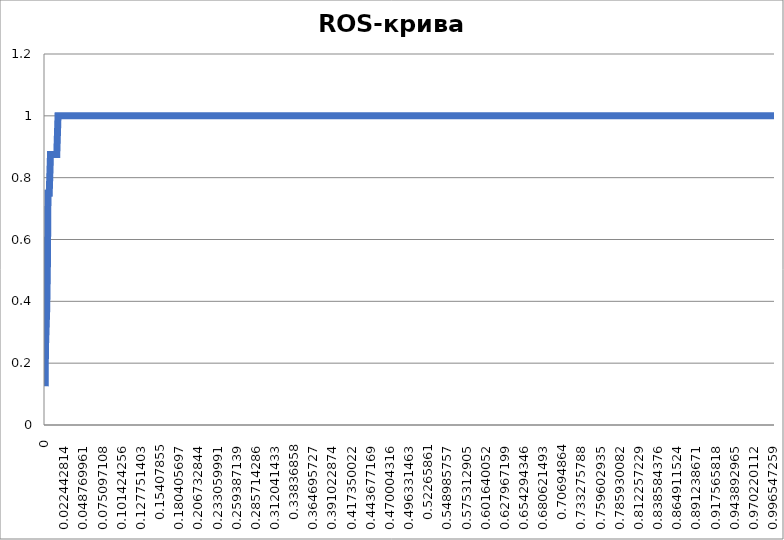
| Category | Чувствительность |
|---|---|
| 0.0 | 0.125 |
| 0.0 | 0.25 |
| 0.0 | 0.25 |
| 0.0 | 0.25 |
| 0.000431592576607631 | 0.25 |
| 0.000863185153215373 | 0.375 |
| 0.001294777729823 | 0.375 |
| 0.001294777729823 | 0.5 |
| 0.00172637030643075 | 0.625 |
| 0.00172637030643075 | 0.75 |
| 0.00172637030643075 | 0.75 |
| 0.00172637030643075 | 0.75 |
| 0.00215796288303838 | 0.75 |
| 0.00258955545964612 | 0.75 |
| 0.00302114803625375 | 0.75 |
| 0.00345274061286149 | 0.75 |
| 0.00388433318946912 | 0.75 |
| 0.00431592576607687 | 0.875 |
| 0.0047475183426845 | 0.875 |
| 0.0047475183426845 | 0.875 |
| 0.00517911091929224 | 0.875 |
| 0.00561070349589987 | 0.875 |
| 0.0060422960725075 | 0.875 |
| 0.00647388864911525 | 0.875 |
| 0.00690548122572288 | 0.875 |
| 0.00733707380233062 | 0.875 |
| 0.00776866637893825 | 0.875 |
| 0.00820025895554599 | 0.875 |
| 0.00863185153215362 | 0.875 |
| 0.00906344410876137 | 0.875 |
| 0.009495036685369 | 0.875 |
| 0.00992662926197674 | 0.875 |
| 0.0103582218385844 | 0.875 |
| 0.0107898144151921 | 0.875 |
| 0.0112214069917997 | 0.875 |
| 0.0116529995684074 | 0.875 |
| 0.0120845921450151 | 0.875 |
| 0.0125161847216227 | 0.875 |
| 0.0129477772982305 | 0.875 |
| 0.0133793698748381 | 0.875 |
| 0.0138109624514459 | 0.875 |
| 0.0142425550280535 | 1 |
| 0.0146741476046612 | 1 |
| 0.0146741476046612 | 1 |
| 0.0151057401812689 | 1 |
| 0.0155373327578766 | 1 |
| 0.0159689253344842 | 1 |
| 0.016400517911092 | 1 |
| 0.0168321104876996 | 1 |
| 0.0172637030643072 | 1 |
| 0.017695295640915 | 1 |
| 0.0181268882175226 | 1 |
| 0.0185584807941304 | 1 |
| 0.018990073370738 | 1 |
| 0.0194216659473457 | 1 |
| 0.0198532585239534 | 1 |
| 0.0202848511005611 | 1 |
| 0.0207164436771687 | 1 |
| 0.0211480362537765 | 1 |
| 0.0215796288303841 | 1 |
| 0.0220112214069919 | 1 |
| 0.0224428139835995 | 1 |
| 0.0228744065602071 | 1 |
| 0.0233059991368149 | 1 |
| 0.0237375917134225 | 1 |
| 0.0241691842900302 | 1 |
| 0.0246007768666379 | 1 |
| 0.0250323694432456 | 1 |
| 0.0254639620198532 | 1 |
| 0.025895554596461 | 1 |
| 0.0263271471730686 | 1 |
| 0.0267587397496764 | 1 |
| 0.027190332326284 | 1 |
| 0.0276219249028917 | 1 |
| 0.0280535174794994 | 1 |
| 0.028485110056107 | 1 |
| 0.0289167026327147 | 1 |
| 0.0293482952093224 | 1 |
| 0.0297798877859301 | 1 |
| 0.0302114803625377 | 1 |
| 0.0306430729391455 | 1 |
| 0.0310746655157531 | 1 |
| 0.0315062580923608 | 1 |
| 0.0319378506689685 | 1 |
| 0.0323694432455762 | 1 |
| 0.0328010358221839 | 1 |
| 0.0332326283987915 | 1 |
| 0.0336642209753992 | 1 |
| 0.0340958135520069 | 1 |
| 0.0345274061286146 | 1 |
| 0.0349589987052222 | 1 |
| 0.03539059128183 | 1 |
| 0.0358221838584376 | 1 |
| 0.0362537764350453 | 1 |
| 0.036685369011653 | 1 |
| 0.0371169615882607 | 1 |
| 0.0375485541648684 | 1 |
| 0.0379801467414761 | 1 |
| 0.0384117393180837 | 1 |
| 0.0388433318946914 | 1 |
| 0.0392749244712991 | 1 |
| 0.0397065170479067 | 1 |
| 0.0401381096245145 | 1 |
| 0.0405697022011221 | 1 |
| 0.0410012947777298 | 1 |
| 0.0414328873543375 | 1 |
| 0.0418644799309452 | 1 |
| 0.0422960725075528 | 1 |
| 0.0427276650841606 | 1 |
| 0.0431592576607682 | 1 |
| 0.043590850237376 | 1 |
| 0.0440224428139836 | 1 |
| 0.0444540353905912 | 1 |
| 0.044885627967199 | 1 |
| 0.0453172205438066 | 1 |
| 0.0457488131204143 | 1 |
| 0.046180405697022 | 1 |
| 0.0466119982736297 | 1 |
| 0.0470435908502374 | 1 |
| 0.0474751834268451 | 1 |
| 0.0479067760034527 | 1 |
| 0.0483383685800605 | 1 |
| 0.0487699611566681 | 1 |
| 0.0492015537332758 | 1 |
| 0.0496331463098835 | 1 |
| 0.0500647388864911 | 1 |
| 0.0504963314630988 | 1 |
| 0.0509279240397065 | 1 |
| 0.0513595166163142 | 1 |
| 0.0517911091929218 | 1 |
| 0.0522227017695296 | 1 |
| 0.0526542943461372 | 1 |
| 0.053085886922745 | 1 |
| 0.0535174794993526 | 1 |
| 0.0539490720759603 | 1 |
| 0.054380664652568 | 1 |
| 0.0548122572291757 | 1 |
| 0.0552438498057833 | 1 |
| 0.055675442382391 | 1 |
| 0.0561070349589987 | 1 |
| 0.0565386275356063 | 1 |
| 0.0569702201122141 | 1 |
| 0.0574018126888217 | 1 |
| 0.0578334052654295 | 1 |
| 0.0582649978420371 | 1 |
| 0.0586965904186448 | 1 |
| 0.0591281829952525 | 1 |
| 0.0595597755718602 | 1 |
| 0.0599913681484678 | 1 |
| 0.0604229607250756 | 1 |
| 0.0608545533016832 | 1 |
| 0.0612861458782908 | 1 |
| 0.0617177384548986 | 1 |
| 0.0621493310315062 | 1 |
| 0.062580923608114 | 1 |
| 0.0630125161847216 | 1 |
| 0.0634441087613293 | 1 |
| 0.063875701337937 | 1 |
| 0.0643072939145447 | 1 |
| 0.0647388864911523 | 1 |
| 0.0651704790677601 | 1 |
| 0.0656020716443677 | 1 |
| 0.0660336642209755 | 1 |
| 0.0664652567975831 | 1 |
| 0.0668968493741907 | 1 |
| 0.0673284419507985 | 1 |
| 0.0677600345274061 | 1 |
| 0.0681916271040138 | 1 |
| 0.0686232196806215 | 1 |
| 0.0690548122572292 | 1 |
| 0.0694864048338368 | 1 |
| 0.0699179974104446 | 1 |
| 0.0703495899870522 | 1 |
| 0.07078118256366 | 1 |
| 0.0712127751402676 | 1 |
| 0.0716443677168753 | 1 |
| 0.072075960293483 | 1 |
| 0.0725075528700906 | 1 |
| 0.0729391454466983 | 1 |
| 0.073370738023306 | 1 |
| 0.0738023305999137 | 1 |
| 0.0742339231765213 | 1 |
| 0.0746655157531291 | 1 |
| 0.0750971083297367 | 1 |
| 0.0755287009063444 | 1 |
| 0.0759602934829521 | 1 |
| 0.0763918860595598 | 1 |
| 0.0768234786361675 | 1 |
| 0.0772550712127752 | 1 |
| 0.0776866637893828 | 1 |
| 0.0781182563659905 | 1 |
| 0.0785498489425982 | 1 |
| 0.0789814415192058 | 1 |
| 0.0794130340958136 | 1 |
| 0.0798446266724212 | 1 |
| 0.0802762192490289 | 1 |
| 0.0807078118256366 | 1 |
| 0.0811394044022443 | 1 |
| 0.081570996978852 | 1 |
| 0.0820025895554597 | 1 |
| 0.0824341821320673 | 1 |
| 0.0828657747086751 | 1 |
| 0.0832973672852827 | 1 |
| 0.0837289598618903 | 1 |
| 0.0841605524384981 | 1 |
| 0.0845921450151057 | 1 |
| 0.0850237375917135 | 1 |
| 0.0854553301683211 | 1 |
| 0.0858869227449288 | 1 |
| 0.0863185153215365 | 1 |
| 0.0867501078981442 | 1 |
| 0.0871817004747518 | 1 |
| 0.0876132930513596 | 1 |
| 0.0880448856279672 | 1 |
| 0.0884764782045748 | 1 |
| 0.0889080707811826 | 1 |
| 0.0893396633577902 | 1 |
| 0.0897712559343979 | 1 |
| 0.0902028485110056 | 1 |
| 0.0906344410876133 | 1 |
| 0.0910660336642209 | 1 |
| 0.0914976262408287 | 1 |
| 0.0919292188174363 | 1 |
| 0.0923608113940441 | 1 |
| 0.0927924039706517 | 1 |
| 0.0932239965472594 | 1 |
| 0.0936555891238671 | 1 |
| 0.0940871817004747 | 1 |
| 0.0945187742770824 | 1 |
| 0.0949503668536901 | 1 |
| 0.0953819594302978 | 1 |
| 0.0958135520069054 | 1 |
| 0.0962451445835132 | 1 |
| 0.0966767371601208 | 1 |
| 0.0971083297367286 | 1 |
| 0.0975399223133362 | 1 |
| 0.0979715148899439 | 1 |
| 0.0984031074665516 | 1 |
| 0.0988347000431593 | 1 |
| 0.0992662926197669 | 1 |
| 0.0996978851963746 | 1 |
| 0.100129477772982 | 1 |
| 0.10056107034959 | 1 |
| 0.100992662926198 | 1 |
| 0.101424255502805 | 1 |
| 0.101855848079413 | 1 |
| 0.102287440656021 | 1 |
| 0.102719033232628 | 1 |
| 0.103150625809236 | 1 |
| 0.103582218385844 | 1 |
| 0.104013810962451 | 1 |
| 0.104445403539059 | 1 |
| 0.104876996115667 | 1 |
| 0.105308588692274 | 1 |
| 0.105740181268882 | 1 |
| 0.10617177384549 | 1 |
| 0.106603366422098 | 1 |
| 0.107034958998705 | 1 |
| 0.107466551575313 | 1 |
| 0.107898144151921 | 1 |
| 0.108329736728528 | 1 |
| 0.108761329305136 | 1 |
| 0.109192921881744 | 1 |
| 0.109624514458351 | 1 |
| 0.110056107034959 | 1 |
| 0.110487699611567 | 1 |
| 0.110919292188174 | 1 |
| 0.111350884764782 | 1 |
| 0.11178247734139 | 1 |
| 0.112214069917997 | 1 |
| 0.112645662494605 | 1 |
| 0.113077255071213 | 1 |
| 0.11350884764782 | 1 |
| 0.113940440224428 | 1 |
| 0.114372032801036 | 1 |
| 0.114803625377644 | 1 |
| 0.115235217954251 | 1 |
| 0.115666810530859 | 1 |
| 0.116098403107467 | 1 |
| 0.116529995684074 | 1 |
| 0.116961588260682 | 1 |
| 0.11739318083729 | 1 |
| 0.117824773413897 | 1 |
| 0.118256365990505 | 1 |
| 0.118687958567113 | 1 |
| 0.11911955114372 | 1 |
| 0.119551143720328 | 1 |
| 0.119982736296936 | 1 |
| 0.120414328873543 | 1 |
| 0.120845921450151 | 1 |
| 0.121277514026759 | 1 |
| 0.121709106603366 | 1 |
| 0.122140699179974 | 1 |
| 0.122572291756582 | 1 |
| 0.123003884333189 | 1 |
| 0.123435476909797 | 1 |
| 0.123867069486405 | 1 |
| 0.124298662063013 | 1 |
| 0.12473025463962 | 1 |
| 0.125161847216228 | 1 |
| 0.125593439792836 | 1 |
| 0.126025032369443 | 1 |
| 0.126456624946051 | 1 |
| 0.126888217522659 | 1 |
| 0.127319810099266 | 1 |
| 0.127751402675874 | 1 |
| 0.128182995252482 | 1 |
| 0.128614587829089 | 1 |
| 0.129046180405697 | 1 |
| 0.129477772982305 | 1 |
| 0.129909365558912 | 1 |
| 0.13034095813552 | 1 |
| 0.130772550712128 | 1 |
| 0.131204143288735 | 1 |
| 0.131635735865343 | 1 |
| 0.132067328441951 | 1 |
| 0.132498921018559 | 1 |
| 0.132930513595166 | 1 |
| 0.133362106171774 | 1 |
| 0.133793698748382 | 1 |
| 0.134225291324989 | 1 |
| 0.134656883901597 | 1 |
| 0.135088476478205 | 1 |
| 0.135520069054812 | 1 |
| 0.13595166163142 | 1 |
| 0.136383254208028 | 1 |
| 0.136814846784635 | 1 |
| 0.137246439361243 | 1 |
| 0.137678031937851 | 1 |
| 0.138109624514458 | 1 |
| 0.138541217091066 | 1 |
| 0.138972809667674 | 1 |
| 0.139404402244281 | 1 |
| 0.139835994820889 | 1 |
| 0.140267587397497 | 1 |
| 0.140699179974104 | 1 |
| 0.141130772550712 | 1 |
| 0.14156236512732 | 1 |
| 0.141993957703928 | 1 |
| 0.142425550280535 | 1 |
| 0.142857142857143 | 1 |
| 0.143288735433751 | 1 |
| 0.143720328010358 | 1 |
| 0.144151920586966 | 1 |
| 0.144583513163574 | 1 |
| 0.145015105740181 | 1 |
| 0.145446698316789 | 1 |
| 0.145878290893397 | 1 |
| 0.146309883470004 | 1 |
| 0.146741476046612 | 1 |
| 0.14717306862322 | 1 |
| 0.147604661199827 | 1 |
| 0.148036253776435 | 1 |
| 0.148467846353043 | 1 |
| 0.14889943892965 | 1 |
| 0.149331031506258 | 1 |
| 0.149762624082866 | 1 |
| 0.150194216659473 | 1 |
| 0.150625809236081 | 1 |
| 0.151057401812689 | 1 |
| 0.151488994389297 | 1 |
| 0.151920586965904 | 1 |
| 0.152352179542512 | 1 |
| 0.15278377211912 | 1 |
| 0.153215364695727 | 1 |
| 0.153646957272335 | 1 |
| 0.154078549848943 | 1 |
| 0.15451014242555 | 1 |
| 0.154941735002158 | 1 |
| 0.155373327578766 | 1 |
| 0.155804920155373 | 1 |
| 0.156236512731981 | 1 |
| 0.156668105308589 | 1 |
| 0.157099697885196 | 1 |
| 0.157531290461804 | 1 |
| 0.157962883038412 | 1 |
| 0.158394475615019 | 1 |
| 0.158826068191627 | 1 |
| 0.159257660768235 | 1 |
| 0.159689253344843 | 1 |
| 0.16012084592145 | 1 |
| 0.160552438498058 | 1 |
| 0.160984031074666 | 1 |
| 0.161415623651273 | 1 |
| 0.161847216227881 | 1 |
| 0.162278808804489 | 1 |
| 0.162710401381096 | 1 |
| 0.163141993957704 | 1 |
| 0.163573586534312 | 1 |
| 0.164005179110919 | 1 |
| 0.164436771687527 | 1 |
| 0.164868364264135 | 1 |
| 0.165299956840742 | 1 |
| 0.16573154941735 | 1 |
| 0.166163141993958 | 1 |
| 0.166594734570565 | 1 |
| 0.167026327147173 | 1 |
| 0.167457919723781 | 1 |
| 0.167889512300388 | 1 |
| 0.168321104876996 | 1 |
| 0.168752697453604 | 1 |
| 0.169184290030212 | 1 |
| 0.169615882606819 | 1 |
| 0.170047475183427 | 1 |
| 0.170479067760035 | 1 |
| 0.170910660336642 | 1 |
| 0.17134225291325 | 1 |
| 0.171773845489858 | 1 |
| 0.172205438066465 | 1 |
| 0.172637030643073 | 1 |
| 0.173068623219681 | 1 |
| 0.173500215796288 | 1 |
| 0.173931808372896 | 1 |
| 0.174363400949504 | 1 |
| 0.174794993526111 | 1 |
| 0.175226586102719 | 1 |
| 0.175658178679327 | 1 |
| 0.176089771255934 | 1 |
| 0.176521363832542 | 1 |
| 0.17695295640915 | 1 |
| 0.177384548985757 | 1 |
| 0.177816141562365 | 1 |
| 0.178247734138973 | 1 |
| 0.178679326715581 | 1 |
| 0.179110919292188 | 1 |
| 0.179542511868796 | 1 |
| 0.179974104445404 | 1 |
| 0.180405697022011 | 1 |
| 0.180837289598619 | 1 |
| 0.181268882175227 | 1 |
| 0.181700474751834 | 1 |
| 0.182132067328442 | 1 |
| 0.18256365990505 | 1 |
| 0.182995252481657 | 1 |
| 0.183426845058265 | 1 |
| 0.183858437634873 | 1 |
| 0.18429003021148 | 1 |
| 0.184721622788088 | 1 |
| 0.185153215364696 | 1 |
| 0.185584807941303 | 1 |
| 0.186016400517911 | 1 |
| 0.186447993094519 | 1 |
| 0.186879585671127 | 1 |
| 0.187311178247734 | 1 |
| 0.187742770824342 | 1 |
| 0.18817436340095 | 1 |
| 0.188605955977557 | 1 |
| 0.189037548554165 | 1 |
| 0.189469141130773 | 1 |
| 0.18990073370738 | 1 |
| 0.190332326283988 | 1 |
| 0.190763918860596 | 1 |
| 0.191195511437203 | 1 |
| 0.191627104013811 | 1 |
| 0.192058696590419 | 1 |
| 0.192490289167026 | 1 |
| 0.192921881743634 | 1 |
| 0.193353474320242 | 1 |
| 0.193785066896849 | 1 |
| 0.194216659473457 | 1 |
| 0.194648252050065 | 1 |
| 0.195079844626672 | 1 |
| 0.19551143720328 | 1 |
| 0.195943029779888 | 1 |
| 0.196374622356496 | 1 |
| 0.196806214933103 | 1 |
| 0.197237807509711 | 1 |
| 0.197669400086319 | 1 |
| 0.198100992662926 | 1 |
| 0.198532585239534 | 1 |
| 0.198964177816142 | 1 |
| 0.199395770392749 | 1 |
| 0.199827362969357 | 1 |
| 0.200258955545965 | 1 |
| 0.200690548122572 | 1 |
| 0.20112214069918 | 1 |
| 0.201553733275788 | 1 |
| 0.201985325852395 | 1 |
| 0.202416918429003 | 1 |
| 0.202848511005611 | 1 |
| 0.203280103582218 | 1 |
| 0.203711696158826 | 1 |
| 0.204143288735434 | 1 |
| 0.204574881312041 | 1 |
| 0.205006473888649 | 1 |
| 0.205438066465257 | 1 |
| 0.205869659041864 | 1 |
| 0.206301251618472 | 1 |
| 0.20673284419508 | 1 |
| 0.207164436771687 | 1 |
| 0.207596029348295 | 1 |
| 0.208027621924903 | 1 |
| 0.208459214501511 | 1 |
| 0.208890807078118 | 1 |
| 0.209322399654726 | 1 |
| 0.209753992231334 | 1 |
| 0.210185584807941 | 1 |
| 0.210617177384549 | 1 |
| 0.211048769961157 | 1 |
| 0.211480362537764 | 1 |
| 0.211911955114372 | 1 |
| 0.21234354769098 | 1 |
| 0.212775140267587 | 1 |
| 0.213206732844195 | 1 |
| 0.213638325420803 | 1 |
| 0.21406991799741 | 1 |
| 0.214501510574018 | 1 |
| 0.214933103150626 | 1 |
| 0.215364695727233 | 1 |
| 0.215796288303841 | 1 |
| 0.216227880880449 | 1 |
| 0.216659473457056 | 1 |
| 0.217091066033664 | 1 |
| 0.217522658610272 | 1 |
| 0.21795425118688 | 1 |
| 0.218385843763487 | 1 |
| 0.218817436340095 | 1 |
| 0.219249028916703 | 1 |
| 0.21968062149331 | 1 |
| 0.220112214069918 | 1 |
| 0.220543806646526 | 1 |
| 0.220975399223133 | 1 |
| 0.221406991799741 | 1 |
| 0.221838584376349 | 1 |
| 0.222270176952956 | 1 |
| 0.222701769529564 | 1 |
| 0.223133362106172 | 1 |
| 0.223564954682779 | 1 |
| 0.223996547259387 | 1 |
| 0.224428139835995 | 1 |
| 0.224859732412602 | 1 |
| 0.22529132498921 | 1 |
| 0.225722917565818 | 1 |
| 0.226154510142426 | 1 |
| 0.226586102719033 | 1 |
| 0.227017695295641 | 1 |
| 0.227449287872249 | 1 |
| 0.227880880448856 | 1 |
| 0.228312473025464 | 1 |
| 0.228744065602072 | 1 |
| 0.229175658178679 | 1 |
| 0.229607250755287 | 1 |
| 0.230038843331895 | 1 |
| 0.230470435908502 | 1 |
| 0.23090202848511 | 1 |
| 0.231333621061718 | 1 |
| 0.231765213638325 | 1 |
| 0.232196806214933 | 1 |
| 0.232628398791541 | 1 |
| 0.233059991368148 | 1 |
| 0.233491583944756 | 1 |
| 0.233923176521364 | 1 |
| 0.234354769097971 | 1 |
| 0.234786361674579 | 1 |
| 0.235217954251187 | 1 |
| 0.235649546827795 | 1 |
| 0.236081139404402 | 1 |
| 0.23651273198101 | 1 |
| 0.236944324557618 | 1 |
| 0.237375917134225 | 1 |
| 0.237807509710833 | 1 |
| 0.238239102287441 | 1 |
| 0.238670694864048 | 1 |
| 0.239102287440656 | 1 |
| 0.239533880017264 | 1 |
| 0.239965472593871 | 1 |
| 0.240397065170479 | 1 |
| 0.240828657747087 | 1 |
| 0.241260250323694 | 1 |
| 0.241691842900302 | 1 |
| 0.24212343547691 | 1 |
| 0.242555028053517 | 1 |
| 0.242986620630125 | 1 |
| 0.243418213206733 | 1 |
| 0.24384980578334 | 1 |
| 0.244281398359948 | 1 |
| 0.244712990936556 | 1 |
| 0.245144583513164 | 1 |
| 0.245576176089771 | 1 |
| 0.246007768666379 | 1 |
| 0.246439361242987 | 1 |
| 0.246870953819594 | 1 |
| 0.247302546396202 | 1 |
| 0.24773413897281 | 1 |
| 0.248165731549417 | 1 |
| 0.248597324126025 | 1 |
| 0.249028916702633 | 1 |
| 0.24946050927924 | 1 |
| 0.249892101855848 | 1 |
| 0.250323694432456 | 1 |
| 0.250755287009063 | 1 |
| 0.251186879585671 | 1 |
| 0.251618472162279 | 1 |
| 0.252050064738886 | 1 |
| 0.252481657315494 | 1 |
| 0.252913249892102 | 1 |
| 0.25334484246871 | 1 |
| 0.253776435045317 | 1 |
| 0.254208027621925 | 1 |
| 0.254639620198533 | 1 |
| 0.25507121277514 | 1 |
| 0.255502805351748 | 1 |
| 0.255934397928356 | 1 |
| 0.256365990504963 | 1 |
| 0.256797583081571 | 1 |
| 0.257229175658179 | 1 |
| 0.257660768234786 | 1 |
| 0.258092360811394 | 1 |
| 0.258523953388002 | 1 |
| 0.258955545964609 | 1 |
| 0.259387138541217 | 1 |
| 0.259818731117825 | 1 |
| 0.260250323694432 | 1 |
| 0.26068191627104 | 1 |
| 0.261113508847648 | 1 |
| 0.261545101424255 | 1 |
| 0.261976694000863 | 1 |
| 0.262408286577471 | 1 |
| 0.262839879154079 | 1 |
| 0.263271471730686 | 1 |
| 0.263703064307294 | 1 |
| 0.264134656883902 | 1 |
| 0.264566249460509 | 1 |
| 0.264997842037117 | 1 |
| 0.265429434613725 | 1 |
| 0.265861027190332 | 1 |
| 0.26629261976694 | 1 |
| 0.266724212343548 | 1 |
| 0.267155804920155 | 1 |
| 0.267587397496763 | 1 |
| 0.268018990073371 | 1 |
| 0.268450582649978 | 1 |
| 0.268882175226586 | 1 |
| 0.269313767803194 | 1 |
| 0.269745360379801 | 1 |
| 0.270176952956409 | 1 |
| 0.270608545533017 | 1 |
| 0.271040138109624 | 1 |
| 0.271471730686232 | 1 |
| 0.27190332326284 | 1 |
| 0.272334915839448 | 1 |
| 0.272766508416055 | 1 |
| 0.273198100992663 | 1 |
| 0.273629693569271 | 1 |
| 0.274061286145878 | 1 |
| 0.274492878722486 | 1 |
| 0.274924471299094 | 1 |
| 0.275356063875701 | 1 |
| 0.275787656452309 | 1 |
| 0.276219249028917 | 1 |
| 0.276650841605524 | 1 |
| 0.277082434182132 | 1 |
| 0.27751402675874 | 1 |
| 0.277945619335347 | 1 |
| 0.278377211911955 | 1 |
| 0.278808804488563 | 1 |
| 0.27924039706517 | 1 |
| 0.279671989641778 | 1 |
| 0.280103582218386 | 1 |
| 0.280535174794994 | 1 |
| 0.280966767371601 | 1 |
| 0.281398359948209 | 1 |
| 0.281829952524817 | 1 |
| 0.282261545101424 | 1 |
| 0.282693137678032 | 1 |
| 0.28312473025464 | 1 |
| 0.283556322831247 | 1 |
| 0.283987915407855 | 1 |
| 0.284419507984463 | 1 |
| 0.28485110056107 | 1 |
| 0.285282693137678 | 1 |
| 0.285714285714286 | 1 |
| 0.286145878290893 | 1 |
| 0.286577470867501 | 1 |
| 0.287009063444109 | 1 |
| 0.287440656020716 | 1 |
| 0.287872248597324 | 1 |
| 0.288303841173932 | 1 |
| 0.288735433750539 | 1 |
| 0.289167026327147 | 1 |
| 0.289598618903755 | 1 |
| 0.290030211480363 | 1 |
| 0.29046180405697 | 1 |
| 0.290893396633578 | 1 |
| 0.291324989210186 | 1 |
| 0.291756581786793 | 1 |
| 0.292188174363401 | 1 |
| 0.292619766940009 | 1 |
| 0.293051359516616 | 1 |
| 0.293482952093224 | 1 |
| 0.293914544669832 | 1 |
| 0.294346137246439 | 1 |
| 0.294777729823047 | 1 |
| 0.295209322399655 | 1 |
| 0.295640914976262 | 1 |
| 0.29607250755287 | 1 |
| 0.296504100129478 | 1 |
| 0.296935692706085 | 1 |
| 0.297367285282693 | 1 |
| 0.297798877859301 | 1 |
| 0.298230470435909 | 1 |
| 0.298662063012516 | 1 |
| 0.299093655589124 | 1 |
| 0.299525248165732 | 1 |
| 0.299956840742339 | 1 |
| 0.300388433318947 | 1 |
| 0.300820025895555 | 1 |
| 0.301251618472162 | 1 |
| 0.30168321104877 | 1 |
| 0.302114803625378 | 1 |
| 0.302546396201985 | 1 |
| 0.302977988778593 | 1 |
| 0.303409581355201 | 1 |
| 0.303841173931808 | 1 |
| 0.304272766508416 | 1 |
| 0.304704359085024 | 1 |
| 0.305135951661631 | 1 |
| 0.305567544238239 | 1 |
| 0.305999136814847 | 1 |
| 0.306430729391454 | 1 |
| 0.306862321968062 | 1 |
| 0.30729391454467 | 1 |
| 0.307725507121278 | 1 |
| 0.308157099697885 | 1 |
| 0.308588692274493 | 1 |
| 0.309020284851101 | 1 |
| 0.309451877427708 | 1 |
| 0.309883470004316 | 1 |
| 0.310315062580924 | 1 |
| 0.310746655157531 | 1 |
| 0.311178247734139 | 1 |
| 0.311609840310747 | 1 |
| 0.312041432887354 | 1 |
| 0.312473025463962 | 1 |
| 0.31290461804057 | 1 |
| 0.313336210617177 | 1 |
| 0.313767803193785 | 1 |
| 0.314199395770393 | 1 |
| 0.314630988347 | 1 |
| 0.315062580923608 | 1 |
| 0.315494173500216 | 1 |
| 0.315925766076823 | 1 |
| 0.316357358653431 | 1 |
| 0.316788951230039 | 1 |
| 0.317220543806647 | 1 |
| 0.317652136383254 | 1 |
| 0.318083728959862 | 1 |
| 0.31851532153647 | 1 |
| 0.318946914113077 | 1 |
| 0.319378506689685 | 1 |
| 0.319810099266293 | 1 |
| 0.3202416918429 | 1 |
| 0.320673284419508 | 1 |
| 0.321104876996116 | 1 |
| 0.321536469572723 | 1 |
| 0.321968062149331 | 1 |
| 0.322399654725939 | 1 |
| 0.322831247302546 | 1 |
| 0.323262839879154 | 1 |
| 0.323694432455762 | 1 |
| 0.324126025032369 | 1 |
| 0.324557617608977 | 1 |
| 0.324989210185585 | 1 |
| 0.325420802762193 | 1 |
| 0.3258523953388 | 1 |
| 0.326283987915408 | 1 |
| 0.326715580492016 | 1 |
| 0.327147173068623 | 1 |
| 0.327578765645231 | 1 |
| 0.328010358221839 | 1 |
| 0.328441950798446 | 1 |
| 0.328873543375054 | 1 |
| 0.329305135951662 | 1 |
| 0.329736728528269 | 1 |
| 0.330168321104877 | 1 |
| 0.330599913681485 | 1 |
| 0.331031506258092 | 1 |
| 0.3314630988347 | 1 |
| 0.331894691411308 | 1 |
| 0.332326283987915 | 1 |
| 0.332757876564523 | 1 |
| 0.333189469141131 | 1 |
| 0.333621061717738 | 1 |
| 0.334052654294346 | 1 |
| 0.334484246870954 | 1 |
| 0.334915839447562 | 1 |
| 0.335347432024169 | 1 |
| 0.335779024600777 | 1 |
| 0.336210617177385 | 1 |
| 0.336642209753992 | 1 |
| 0.3370738023306 | 1 |
| 0.337505394907208 | 1 |
| 0.337936987483815 | 1 |
| 0.338368580060423 | 1 |
| 0.338800172637031 | 1 |
| 0.339231765213638 | 1 |
| 0.339663357790246 | 1 |
| 0.340094950366854 | 1 |
| 0.340526542943461 | 1 |
| 0.340958135520069 | 1 |
| 0.341389728096677 | 1 |
| 0.341821320673284 | 1 |
| 0.342252913249892 | 1 |
| 0.3426845058265 | 1 |
| 0.343116098403107 | 1 |
| 0.343547690979715 | 1 |
| 0.343979283556323 | 1 |
| 0.344410876132931 | 1 |
| 0.344842468709538 | 1 |
| 0.345274061286146 | 1 |
| 0.345705653862754 | 1 |
| 0.346137246439361 | 1 |
| 0.346568839015969 | 1 |
| 0.347000431592577 | 1 |
| 0.347432024169184 | 1 |
| 0.347863616745792 | 1 |
| 0.3482952093224 | 1 |
| 0.348726801899007 | 1 |
| 0.349158394475615 | 1 |
| 0.349589987052223 | 1 |
| 0.35002157962883 | 1 |
| 0.350453172205438 | 1 |
| 0.350884764782046 | 1 |
| 0.351316357358653 | 1 |
| 0.351747949935261 | 1 |
| 0.352179542511869 | 1 |
| 0.352611135088476 | 1 |
| 0.353042727665084 | 1 |
| 0.353474320241692 | 1 |
| 0.3539059128183 | 1 |
| 0.354337505394907 | 1 |
| 0.354769097971515 | 1 |
| 0.355200690548122 | 1 |
| 0.35563228312473 | 1 |
| 0.356063875701338 | 1 |
| 0.356495468277946 | 1 |
| 0.356927060854553 | 1 |
| 0.357358653431161 | 1 |
| 0.357790246007769 | 1 |
| 0.358221838584376 | 1 |
| 0.358653431160984 | 1 |
| 0.359085023737592 | 1 |
| 0.359516616314199 | 1 |
| 0.359948208890807 | 1 |
| 0.360379801467415 | 1 |
| 0.360811394044022 | 1 |
| 0.36124298662063 | 1 |
| 0.361674579197238 | 1 |
| 0.362106171773845 | 1 |
| 0.362537764350453 | 1 |
| 0.362969356927061 | 1 |
| 0.363400949503669 | 1 |
| 0.363832542080276 | 1 |
| 0.364264134656884 | 1 |
| 0.364695727233491 | 1 |
| 0.365127319810099 | 1 |
| 0.365558912386707 | 1 |
| 0.365990504963315 | 1 |
| 0.366422097539922 | 1 |
| 0.36685369011653 | 1 |
| 0.367285282693138 | 1 |
| 0.367716875269745 | 1 |
| 0.368148467846353 | 1 |
| 0.368580060422961 | 1 |
| 0.369011652999568 | 1 |
| 0.369443245576176 | 1 |
| 0.369874838152784 | 1 |
| 0.370306430729391 | 1 |
| 0.370738023305999 | 1 |
| 0.371169615882607 | 1 |
| 0.371601208459214 | 1 |
| 0.372032801035822 | 1 |
| 0.37246439361243 | 1 |
| 0.372895986189038 | 1 |
| 0.373327578765645 | 1 |
| 0.373759171342253 | 1 |
| 0.374190763918861 | 1 |
| 0.374622356495468 | 1 |
| 0.375053949072076 | 1 |
| 0.375485541648684 | 1 |
| 0.375917134225291 | 1 |
| 0.376348726801899 | 1 |
| 0.376780319378507 | 1 |
| 0.377211911955114 | 1 |
| 0.377643504531722 | 1 |
| 0.37807509710833 | 1 |
| 0.378506689684937 | 1 |
| 0.378938282261545 | 1 |
| 0.379369874838153 | 1 |
| 0.37980146741476 | 1 |
| 0.380233059991368 | 1 |
| 0.380664652567976 | 1 |
| 0.381096245144583 | 1 |
| 0.381527837721191 | 1 |
| 0.381959430297799 | 1 |
| 0.382391022874407 | 1 |
| 0.382822615451014 | 1 |
| 0.383254208027622 | 1 |
| 0.38368580060423 | 1 |
| 0.384117393180837 | 1 |
| 0.384548985757445 | 1 |
| 0.384980578334053 | 1 |
| 0.38541217091066 | 1 |
| 0.385843763487268 | 1 |
| 0.386275356063876 | 1 |
| 0.386706948640483 | 1 |
| 0.387138541217091 | 1 |
| 0.387570133793699 | 1 |
| 0.388001726370306 | 1 |
| 0.388433318946914 | 1 |
| 0.388864911523522 | 1 |
| 0.38929650410013 | 1 |
| 0.389728096676737 | 1 |
| 0.390159689253345 | 1 |
| 0.390591281829952 | 1 |
| 0.39102287440656 | 1 |
| 0.391454466983168 | 1 |
| 0.391886059559776 | 1 |
| 0.392317652136383 | 1 |
| 0.392749244712991 | 1 |
| 0.393180837289599 | 1 |
| 0.393612429866206 | 1 |
| 0.394044022442814 | 1 |
| 0.394475615019422 | 1 |
| 0.394907207596029 | 1 |
| 0.395338800172637 | 1 |
| 0.395770392749245 | 1 |
| 0.396201985325852 | 1 |
| 0.39663357790246 | 1 |
| 0.397065170479068 | 1 |
| 0.397496763055675 | 1 |
| 0.397928355632283 | 1 |
| 0.398359948208891 | 1 |
| 0.398791540785498 | 1 |
| 0.399223133362106 | 1 |
| 0.399654725938714 | 1 |
| 0.400086318515321 | 1 |
| 0.400517911091929 | 1 |
| 0.400949503668537 | 1 |
| 0.401381096245145 | 1 |
| 0.401812688821752 | 1 |
| 0.40224428139836 | 1 |
| 0.402675873974968 | 1 |
| 0.403107466551575 | 1 |
| 0.403539059128183 | 1 |
| 0.403970651704791 | 1 |
| 0.404402244281398 | 1 |
| 0.404833836858006 | 1 |
| 0.405265429434614 | 1 |
| 0.405697022011221 | 1 |
| 0.406128614587829 | 1 |
| 0.406560207164437 | 1 |
| 0.406991799741044 | 1 |
| 0.407423392317652 | 1 |
| 0.40785498489426 | 1 |
| 0.408286577470868 | 1 |
| 0.408718170047475 | 1 |
| 0.409149762624083 | 1 |
| 0.409581355200691 | 1 |
| 0.410012947777298 | 1 |
| 0.410444540353906 | 1 |
| 0.410876132930514 | 1 |
| 0.411307725507121 | 1 |
| 0.411739318083729 | 1 |
| 0.412170910660337 | 1 |
| 0.412602503236944 | 1 |
| 0.413034095813552 | 1 |
| 0.41346568839016 | 1 |
| 0.413897280966767 | 1 |
| 0.414328873543375 | 1 |
| 0.414760466119983 | 1 |
| 0.41519205869659 | 1 |
| 0.415623651273198 | 1 |
| 0.416055243849806 | 1 |
| 0.416486836426413 | 1 |
| 0.416918429003021 | 1 |
| 0.417350021579629 | 1 |
| 0.417781614156236 | 1 |
| 0.418213206732844 | 1 |
| 0.418644799309452 | 1 |
| 0.41907639188606 | 1 |
| 0.419507984462667 | 1 |
| 0.419939577039275 | 1 |
| 0.420371169615883 | 1 |
| 0.42080276219249 | 1 |
| 0.421234354769098 | 1 |
| 0.421665947345706 | 1 |
| 0.422097539922313 | 1 |
| 0.422529132498921 | 1 |
| 0.422960725075529 | 1 |
| 0.423392317652136 | 1 |
| 0.423823910228744 | 1 |
| 0.424255502805352 | 1 |
| 0.424687095381959 | 1 |
| 0.425118687958567 | 1 |
| 0.425550280535175 | 1 |
| 0.425981873111782 | 1 |
| 0.42641346568839 | 1 |
| 0.426845058264998 | 1 |
| 0.427276650841606 | 1 |
| 0.427708243418213 | 1 |
| 0.428139835994821 | 1 |
| 0.428571428571429 | 1 |
| 0.429003021148036 | 1 |
| 0.429434613724644 | 1 |
| 0.429866206301252 | 1 |
| 0.430297798877859 | 1 |
| 0.430729391454467 | 1 |
| 0.431160984031075 | 1 |
| 0.431592576607682 | 1 |
| 0.43202416918429 | 1 |
| 0.432455761760898 | 1 |
| 0.432887354337505 | 1 |
| 0.433318946914113 | 1 |
| 0.433750539490721 | 1 |
| 0.434182132067329 | 1 |
| 0.434613724643936 | 1 |
| 0.435045317220544 | 1 |
| 0.435476909797151 | 1 |
| 0.435908502373759 | 1 |
| 0.436340094950367 | 1 |
| 0.436771687526974 | 1 |
| 0.437203280103582 | 1 |
| 0.43763487268019 | 1 |
| 0.438066465256798 | 1 |
| 0.438498057833405 | 1 |
| 0.438929650410013 | 1 |
| 0.439361242986621 | 1 |
| 0.439792835563228 | 1 |
| 0.440224428139836 | 1 |
| 0.440656020716444 | 1 |
| 0.441087613293051 | 1 |
| 0.441519205869659 | 1 |
| 0.441950798446267 | 1 |
| 0.442382391022874 | 1 |
| 0.442813983599482 | 1 |
| 0.44324557617609 | 1 |
| 0.443677168752697 | 1 |
| 0.444108761329305 | 1 |
| 0.444540353905913 | 1 |
| 0.44497194648252 | 1 |
| 0.445403539059128 | 1 |
| 0.445835131635736 | 1 |
| 0.446266724212344 | 1 |
| 0.446698316788951 | 1 |
| 0.447129909365559 | 1 |
| 0.447561501942167 | 1 |
| 0.447993094518774 | 1 |
| 0.448424687095382 | 1 |
| 0.44885627967199 | 1 |
| 0.449287872248597 | 1 |
| 0.449719464825205 | 1 |
| 0.450151057401813 | 1 |
| 0.45058264997842 | 1 |
| 0.451014242555028 | 1 |
| 0.451445835131636 | 1 |
| 0.451877427708243 | 1 |
| 0.452309020284851 | 1 |
| 0.452740612861459 | 1 |
| 0.453172205438066 | 1 |
| 0.453603798014674 | 1 |
| 0.454035390591282 | 1 |
| 0.454466983167889 | 1 |
| 0.454898575744497 | 1 |
| 0.455330168321105 | 1 |
| 0.455761760897713 | 1 |
| 0.45619335347432 | 1 |
| 0.456624946050928 | 1 |
| 0.457056538627536 | 1 |
| 0.457488131204143 | 1 |
| 0.457919723780751 | 1 |
| 0.458351316357359 | 1 |
| 0.458782908933966 | 1 |
| 0.459214501510574 | 1 |
| 0.459646094087182 | 1 |
| 0.460077686663789 | 1 |
| 0.460509279240397 | 1 |
| 0.460940871817005 | 1 |
| 0.461372464393612 | 1 |
| 0.46180405697022 | 1 |
| 0.462235649546828 | 1 |
| 0.462667242123435 | 1 |
| 0.463098834700043 | 1 |
| 0.463530427276651 | 1 |
| 0.463962019853259 | 1 |
| 0.464393612429866 | 1 |
| 0.464825205006474 | 1 |
| 0.465256797583082 | 1 |
| 0.465688390159689 | 1 |
| 0.466119982736297 | 1 |
| 0.466551575312905 | 1 |
| 0.466983167889512 | 1 |
| 0.46741476046612 | 1 |
| 0.467846353042728 | 1 |
| 0.468277945619335 | 1 |
| 0.468709538195943 | 1 |
| 0.469141130772551 | 1 |
| 0.469572723349158 | 1 |
| 0.470004315925766 | 1 |
| 0.470435908502374 | 1 |
| 0.470867501078981 | 1 |
| 0.471299093655589 | 1 |
| 0.471730686232197 | 1 |
| 0.472162278808804 | 1 |
| 0.472593871385412 | 1 |
| 0.47302546396202 | 1 |
| 0.473457056538628 | 1 |
| 0.473888649115235 | 1 |
| 0.474320241691843 | 1 |
| 0.474751834268451 | 1 |
| 0.475183426845058 | 1 |
| 0.475615019421666 | 1 |
| 0.476046611998274 | 1 |
| 0.476478204574881 | 1 |
| 0.476909797151489 | 1 |
| 0.477341389728097 | 1 |
| 0.477772982304704 | 1 |
| 0.478204574881312 | 1 |
| 0.47863616745792 | 1 |
| 0.479067760034527 | 1 |
| 0.479499352611135 | 1 |
| 0.479930945187743 | 1 |
| 0.48036253776435 | 1 |
| 0.480794130340958 | 1 |
| 0.481225722917566 | 1 |
| 0.481657315494173 | 1 |
| 0.482088908070781 | 1 |
| 0.482520500647389 | 1 |
| 0.482952093223997 | 1 |
| 0.483383685800604 | 1 |
| 0.483815278377212 | 1 |
| 0.48424687095382 | 1 |
| 0.484678463530427 | 1 |
| 0.485110056107035 | 1 |
| 0.485541648683643 | 1 |
| 0.48597324126025 | 1 |
| 0.486404833836858 | 1 |
| 0.486836426413466 | 1 |
| 0.487268018990073 | 1 |
| 0.487699611566681 | 1 |
| 0.488131204143289 | 1 |
| 0.488562796719896 | 1 |
| 0.488994389296504 | 1 |
| 0.489425981873112 | 1 |
| 0.489857574449719 | 1 |
| 0.490289167026327 | 1 |
| 0.490720759602935 | 1 |
| 0.491152352179543 | 1 |
| 0.49158394475615 | 1 |
| 0.492015537332758 | 1 |
| 0.492447129909366 | 1 |
| 0.492878722485973 | 1 |
| 0.493310315062581 | 1 |
| 0.493741907639189 | 1 |
| 0.494173500215796 | 1 |
| 0.494605092792404 | 1 |
| 0.495036685369012 | 1 |
| 0.495468277945619 | 1 |
| 0.495899870522227 | 1 |
| 0.496331463098835 | 1 |
| 0.496763055675442 | 1 |
| 0.49719464825205 | 1 |
| 0.497626240828658 | 1 |
| 0.498057833405265 | 1 |
| 0.498489425981873 | 1 |
| 0.498921018558481 | 1 |
| 0.499352611135088 | 1 |
| 0.499784203711696 | 1 |
| 0.500215796288304 | 1 |
| 0.500647388864911 | 1 |
| 0.501078981441519 | 1 |
| 0.501510574018127 | 1 |
| 0.501942166594735 | 1 |
| 0.502373759171342 | 1 |
| 0.50280535174795 | 1 |
| 0.503236944324558 | 1 |
| 0.503668536901165 | 1 |
| 0.504100129477773 | 1 |
| 0.504531722054381 | 1 |
| 0.504963314630988 | 1 |
| 0.505394907207596 | 1 |
| 0.505826499784204 | 1 |
| 0.506258092360811 | 1 |
| 0.506689684937419 | 1 |
| 0.507121277514027 | 1 |
| 0.507552870090634 | 1 |
| 0.507984462667242 | 1 |
| 0.50841605524385 | 1 |
| 0.508847647820458 | 1 |
| 0.509279240397065 | 1 |
| 0.509710832973673 | 1 |
| 0.510142425550281 | 1 |
| 0.510574018126888 | 1 |
| 0.511005610703496 | 1 |
| 0.511437203280104 | 1 |
| 0.511868795856711 | 1 |
| 0.512300388433319 | 1 |
| 0.512731981009927 | 1 |
| 0.513163573586534 | 1 |
| 0.513595166163142 | 1 |
| 0.51402675873975 | 1 |
| 0.514458351316357 | 1 |
| 0.514889943892965 | 1 |
| 0.515321536469573 | 1 |
| 0.51575312904618 | 1 |
| 0.516184721622788 | 1 |
| 0.516616314199396 | 1 |
| 0.517047906776003 | 1 |
| 0.517479499352611 | 1 |
| 0.517911091929219 | 1 |
| 0.518342684505827 | 1 |
| 0.518774277082434 | 1 |
| 0.519205869659042 | 1 |
| 0.51963746223565 | 1 |
| 0.520069054812257 | 1 |
| 0.520500647388865 | 1 |
| 0.520932239965473 | 1 |
| 0.52136383254208 | 1 |
| 0.521795425118688 | 1 |
| 0.522227017695296 | 1 |
| 0.522658610271903 | 1 |
| 0.523090202848511 | 1 |
| 0.523521795425119 | 1 |
| 0.523953388001726 | 1 |
| 0.524384980578334 | 1 |
| 0.524816573154942 | 1 |
| 0.525248165731549 | 1 |
| 0.525679758308157 | 1 |
| 0.526111350884765 | 1 |
| 0.526542943461372 | 1 |
| 0.52697453603798 | 1 |
| 0.527406128614588 | 1 |
| 0.527837721191196 | 1 |
| 0.528269313767803 | 1 |
| 0.528700906344411 | 1 |
| 0.529132498921019 | 1 |
| 0.529564091497626 | 1 |
| 0.529995684074234 | 1 |
| 0.530427276650842 | 1 |
| 0.530858869227449 | 1 |
| 0.531290461804057 | 1 |
| 0.531722054380665 | 1 |
| 0.532153646957272 | 1 |
| 0.53258523953388 | 1 |
| 0.533016832110488 | 1 |
| 0.533448424687095 | 1 |
| 0.533880017263703 | 1 |
| 0.534311609840311 | 1 |
| 0.534743202416918 | 1 |
| 0.535174794993526 | 1 |
| 0.535606387570134 | 1 |
| 0.536037980146741 | 1 |
| 0.536469572723349 | 1 |
| 0.536901165299957 | 1 |
| 0.537332757876565 | 1 |
| 0.537764350453172 | 1 |
| 0.53819594302978 | 1 |
| 0.538627535606388 | 1 |
| 0.539059128182995 | 1 |
| 0.539490720759603 | 1 |
| 0.539922313336211 | 1 |
| 0.540353905912818 | 1 |
| 0.540785498489426 | 1 |
| 0.541217091066034 | 1 |
| 0.541648683642641 | 1 |
| 0.542080276219249 | 1 |
| 0.542511868795857 | 1 |
| 0.542943461372464 | 1 |
| 0.543375053949072 | 1 |
| 0.54380664652568 | 1 |
| 0.544238239102287 | 1 |
| 0.544669831678895 | 1 |
| 0.545101424255503 | 1 |
| 0.54553301683211 | 1 |
| 0.545964609408718 | 1 |
| 0.546396201985326 | 1 |
| 0.546827794561934 | 1 |
| 0.547259387138541 | 1 |
| 0.547690979715149 | 1 |
| 0.548122572291757 | 1 |
| 0.548554164868364 | 1 |
| 0.548985757444972 | 1 |
| 0.54941735002158 | 1 |
| 0.549848942598187 | 1 |
| 0.550280535174795 | 1 |
| 0.550712127751403 | 1 |
| 0.55114372032801 | 1 |
| 0.551575312904618 | 1 |
| 0.552006905481226 | 1 |
| 0.552438498057833 | 1 |
| 0.552870090634441 | 1 |
| 0.553301683211049 | 1 |
| 0.553733275787657 | 1 |
| 0.554164868364264 | 1 |
| 0.554596460940872 | 1 |
| 0.55502805351748 | 1 |
| 0.555459646094087 | 1 |
| 0.555891238670695 | 1 |
| 0.556322831247303 | 1 |
| 0.55675442382391 | 1 |
| 0.557186016400518 | 1 |
| 0.557617608977126 | 1 |
| 0.558049201553733 | 1 |
| 0.558480794130341 | 1 |
| 0.558912386706949 | 1 |
| 0.559343979283556 | 1 |
| 0.559775571860164 | 1 |
| 0.560207164436772 | 1 |
| 0.560638757013379 | 1 |
| 0.561070349589987 | 1 |
| 0.561501942166595 | 1 |
| 0.561933534743202 | 1 |
| 0.56236512731981 | 1 |
| 0.562796719896418 | 1 |
| 0.563228312473026 | 1 |
| 0.563659905049633 | 1 |
| 0.564091497626241 | 1 |
| 0.564523090202848 | 1 |
| 0.564954682779456 | 1 |
| 0.565386275356064 | 1 |
| 0.565817867932672 | 1 |
| 0.566249460509279 | 1 |
| 0.566681053085887 | 1 |
| 0.567112645662495 | 1 |
| 0.567544238239102 | 1 |
| 0.56797583081571 | 1 |
| 0.568407423392318 | 1 |
| 0.568839015968925 | 1 |
| 0.569270608545533 | 1 |
| 0.569702201122141 | 1 |
| 0.570133793698748 | 1 |
| 0.570565386275356 | 1 |
| 0.570996978851964 | 1 |
| 0.571428571428571 | 1 |
| 0.571860164005179 | 1 |
| 0.572291756581787 | 1 |
| 0.572723349158395 | 1 |
| 0.573154941735002 | 1 |
| 0.57358653431161 | 1 |
| 0.574018126888218 | 1 |
| 0.574449719464825 | 1 |
| 0.574881312041433 | 1 |
| 0.575312904618041 | 1 |
| 0.575744497194648 | 1 |
| 0.576176089771256 | 1 |
| 0.576607682347864 | 1 |
| 0.577039274924471 | 1 |
| 0.577470867501079 | 1 |
| 0.577902460077687 | 1 |
| 0.578334052654294 | 1 |
| 0.578765645230902 | 1 |
| 0.57919723780751 | 1 |
| 0.579628830384117 | 1 |
| 0.580060422960725 | 1 |
| 0.580492015537333 | 1 |
| 0.58092360811394 | 1 |
| 0.581355200690548 | 1 |
| 0.581786793267156 | 1 |
| 0.582218385843763 | 1 |
| 0.582649978420371 | 1 |
| 0.583081570996979 | 1 |
| 0.583513163573586 | 1 |
| 0.583944756150194 | 1 |
| 0.584376348726802 | 1 |
| 0.58480794130341 | 1 |
| 0.585239533880017 | 1 |
| 0.585671126456625 | 1 |
| 0.586102719033233 | 1 |
| 0.58653431160984 | 1 |
| 0.586965904186448 | 1 |
| 0.587397496763056 | 1 |
| 0.587829089339663 | 1 |
| 0.588260681916271 | 1 |
| 0.588692274492879 | 1 |
| 0.589123867069486 | 1 |
| 0.589555459646094 | 1 |
| 0.589987052222702 | 1 |
| 0.590418644799309 | 1 |
| 0.590850237375917 | 1 |
| 0.591281829952525 | 1 |
| 0.591713422529133 | 1 |
| 0.59214501510574 | 1 |
| 0.592576607682348 | 1 |
| 0.593008200258956 | 1 |
| 0.593439792835563 | 1 |
| 0.593871385412171 | 1 |
| 0.594302977988779 | 1 |
| 0.594734570565386 | 1 |
| 0.595166163141994 | 1 |
| 0.595597755718602 | 1 |
| 0.596029348295209 | 1 |
| 0.596460940871817 | 1 |
| 0.596892533448425 | 1 |
| 0.597324126025032 | 1 |
| 0.59775571860164 | 1 |
| 0.598187311178248 | 1 |
| 0.598618903754856 | 1 |
| 0.599050496331463 | 1 |
| 0.599482088908071 | 1 |
| 0.599913681484678 | 1 |
| 0.600345274061286 | 1 |
| 0.600776866637894 | 1 |
| 0.601208459214501 | 1 |
| 0.601640051791109 | 1 |
| 0.602071644367717 | 1 |
| 0.602503236944325 | 1 |
| 0.602934829520932 | 1 |
| 0.60336642209754 | 1 |
| 0.603798014674148 | 1 |
| 0.604229607250755 | 1 |
| 0.604661199827363 | 1 |
| 0.605092792403971 | 1 |
| 0.605524384980578 | 1 |
| 0.605955977557186 | 1 |
| 0.606387570133794 | 1 |
| 0.606819162710401 | 1 |
| 0.607250755287009 | 1 |
| 0.607682347863617 | 1 |
| 0.608113940440224 | 1 |
| 0.608545533016832 | 1 |
| 0.60897712559344 | 1 |
| 0.609408718170047 | 1 |
| 0.609840310746655 | 1 |
| 0.610271903323263 | 1 |
| 0.610703495899871 | 1 |
| 0.611135088476478 | 1 |
| 0.611566681053086 | 1 |
| 0.611998273629694 | 1 |
| 0.612429866206301 | 1 |
| 0.612861458782909 | 1 |
| 0.613293051359517 | 1 |
| 0.613724643936124 | 1 |
| 0.614156236512732 | 1 |
| 0.61458782908934 | 1 |
| 0.615019421665947 | 1 |
| 0.615451014242555 | 1 |
| 0.615882606819163 | 1 |
| 0.61631419939577 | 1 |
| 0.616745791972378 | 1 |
| 0.617177384548986 | 1 |
| 0.617608977125594 | 1 |
| 0.618040569702201 | 1 |
| 0.618472162278809 | 1 |
| 0.618903754855416 | 1 |
| 0.619335347432024 | 1 |
| 0.619766940008632 | 1 |
| 0.620198532585239 | 1 |
| 0.620630125161847 | 1 |
| 0.621061717738455 | 1 |
| 0.621493310315063 | 1 |
| 0.62192490289167 | 1 |
| 0.622356495468278 | 1 |
| 0.622788088044886 | 1 |
| 0.623219680621493 | 1 |
| 0.623651273198101 | 1 |
| 0.624082865774709 | 1 |
| 0.624514458351316 | 1 |
| 0.624946050927924 | 1 |
| 0.625377643504532 | 1 |
| 0.625809236081139 | 1 |
| 0.626240828657747 | 1 |
| 0.626672421234355 | 1 |
| 0.627104013810962 | 1 |
| 0.62753560638757 | 1 |
| 0.627967198964178 | 1 |
| 0.628398791540785 | 1 |
| 0.628830384117393 | 1 |
| 0.629261976694001 | 1 |
| 0.629693569270609 | 1 |
| 0.630125161847216 | 1 |
| 0.630556754423824 | 1 |
| 0.630988347000432 | 1 |
| 0.631419939577039 | 1 |
| 0.631851532153647 | 1 |
| 0.632283124730255 | 1 |
| 0.632714717306862 | 1 |
| 0.63314630988347 | 1 |
| 0.633577902460078 | 1 |
| 0.634009495036685 | 1 |
| 0.634441087613293 | 1 |
| 0.634872680189901 | 1 |
| 0.635304272766508 | 1 |
| 0.635735865343116 | 1 |
| 0.636167457919724 | 1 |
| 0.636599050496332 | 1 |
| 0.637030643072939 | 1 |
| 0.637462235649547 | 1 |
| 0.637893828226155 | 1 |
| 0.638325420802762 | 1 |
| 0.63875701337937 | 1 |
| 0.639188605955977 | 1 |
| 0.639620198532585 | 1 |
| 0.640051791109193 | 1 |
| 0.640483383685801 | 1 |
| 0.640914976262408 | 1 |
| 0.641346568839016 | 1 |
| 0.641778161415624 | 1 |
| 0.642209753992231 | 1 |
| 0.642641346568839 | 1 |
| 0.643072939145447 | 1 |
| 0.643504531722054 | 1 |
| 0.643936124298662 | 1 |
| 0.64436771687527 | 1 |
| 0.644799309451877 | 1 |
| 0.645230902028485 | 1 |
| 0.645662494605093 | 1 |
| 0.6460940871817 | 1 |
| 0.646525679758308 | 1 |
| 0.646957272334916 | 1 |
| 0.647388864911524 | 1 |
| 0.647820457488131 | 1 |
| 0.648252050064739 | 1 |
| 0.648683642641347 | 1 |
| 0.649115235217954 | 1 |
| 0.649546827794562 | 1 |
| 0.64997842037117 | 1 |
| 0.650410012947777 | 1 |
| 0.650841605524385 | 1 |
| 0.651273198100993 | 1 |
| 0.6517047906776 | 1 |
| 0.652136383254208 | 1 |
| 0.652567975830816 | 1 |
| 0.652999568407423 | 1 |
| 0.653431160984031 | 1 |
| 0.653862753560639 | 1 |
| 0.654294346137246 | 1 |
| 0.654725938713854 | 1 |
| 0.655157531290462 | 1 |
| 0.65558912386707 | 1 |
| 0.656020716443677 | 1 |
| 0.656452309020285 | 1 |
| 0.656883901596893 | 1 |
| 0.6573154941735 | 1 |
| 0.657747086750108 | 1 |
| 0.658178679326716 | 1 |
| 0.658610271903323 | 1 |
| 0.659041864479931 | 1 |
| 0.659473457056539 | 1 |
| 0.659905049633146 | 1 |
| 0.660336642209754 | 1 |
| 0.660768234786362 | 1 |
| 0.661199827362969 | 1 |
| 0.661631419939577 | 1 |
| 0.662063012516185 | 1 |
| 0.662494605092792 | 1 |
| 0.6629261976694 | 1 |
| 0.663357790246008 | 1 |
| 0.663789382822615 | 1 |
| 0.664220975399223 | 1 |
| 0.664652567975831 | 1 |
| 0.665084160552438 | 1 |
| 0.665515753129046 | 1 |
| 0.665947345705654 | 1 |
| 0.666378938282262 | 1 |
| 0.666810530858869 | 1 |
| 0.667242123435477 | 1 |
| 0.667673716012085 | 1 |
| 0.668105308588692 | 1 |
| 0.6685369011653 | 1 |
| 0.668968493741908 | 1 |
| 0.669400086318515 | 1 |
| 0.669831678895123 | 1 |
| 0.670263271471731 | 1 |
| 0.670694864048338 | 1 |
| 0.671126456624946 | 1 |
| 0.671558049201554 | 1 |
| 0.671989641778161 | 1 |
| 0.672421234354769 | 1 |
| 0.672852826931377 | 1 |
| 0.673284419507984 | 1 |
| 0.673716012084592 | 1 |
| 0.6741476046612 | 1 |
| 0.674579197237807 | 1 |
| 0.675010789814415 | 1 |
| 0.675442382391023 | 1 |
| 0.675873974967631 | 1 |
| 0.676305567544238 | 1 |
| 0.676737160120846 | 1 |
| 0.677168752697454 | 1 |
| 0.677600345274061 | 1 |
| 0.678031937850669 | 1 |
| 0.678463530427277 | 1 |
| 0.678895123003884 | 1 |
| 0.679326715580492 | 1 |
| 0.6797583081571 | 1 |
| 0.680189900733707 | 1 |
| 0.680621493310315 | 1 |
| 0.681053085886923 | 1 |
| 0.68148467846353 | 1 |
| 0.681916271040138 | 1 |
| 0.682347863616746 | 1 |
| 0.682779456193353 | 1 |
| 0.683211048769961 | 1 |
| 0.683642641346569 | 1 |
| 0.684074233923176 | 1 |
| 0.684505826499784 | 1 |
| 0.684937419076392 | 1 |
| 0.685369011653 | 1 |
| 0.685800604229607 | 1 |
| 0.686232196806215 | 1 |
| 0.686663789382823 | 1 |
| 0.68709538195943 | 1 |
| 0.687526974536038 | 1 |
| 0.687958567112646 | 1 |
| 0.688390159689253 | 1 |
| 0.688821752265861 | 1 |
| 0.689253344842469 | 1 |
| 0.689684937419076 | 1 |
| 0.690116529995684 | 1 |
| 0.690548122572292 | 1 |
| 0.690979715148899 | 1 |
| 0.691411307725507 | 1 |
| 0.691842900302115 | 1 |
| 0.692274492878723 | 1 |
| 0.69270608545533 | 1 |
| 0.693137678031938 | 1 |
| 0.693569270608545 | 1 |
| 0.694000863185153 | 1 |
| 0.694432455761761 | 1 |
| 0.694864048338369 | 1 |
| 0.695295640914976 | 1 |
| 0.695727233491584 | 1 |
| 0.696158826068192 | 1 |
| 0.696590418644799 | 1 |
| 0.697022011221407 | 1 |
| 0.697453603798015 | 1 |
| 0.697885196374622 | 1 |
| 0.69831678895123 | 1 |
| 0.698748381527838 | 1 |
| 0.699179974104445 | 1 |
| 0.699611566681053 | 1 |
| 0.700043159257661 | 1 |
| 0.700474751834268 | 1 |
| 0.700906344410876 | 1 |
| 0.701337936987484 | 1 |
| 0.701769529564092 | 1 |
| 0.702201122140699 | 1 |
| 0.702632714717307 | 1 |
| 0.703064307293915 | 1 |
| 0.703495899870522 | 1 |
| 0.70392749244713 | 1 |
| 0.704359085023738 | 1 |
| 0.704790677600345 | 1 |
| 0.705222270176953 | 1 |
| 0.705653862753561 | 1 |
| 0.706085455330168 | 1 |
| 0.706517047906776 | 1 |
| 0.706948640483384 | 1 |
| 0.707380233059991 | 1 |
| 0.707811825636599 | 1 |
| 0.708243418213207 | 1 |
| 0.708675010789814 | 1 |
| 0.709106603366422 | 1 |
| 0.70953819594303 | 1 |
| 0.709969788519637 | 1 |
| 0.710401381096245 | 1 |
| 0.710832973672853 | 1 |
| 0.711264566249461 | 1 |
| 0.711696158826068 | 1 |
| 0.712127751402676 | 1 |
| 0.712559343979284 | 1 |
| 0.712990936555891 | 1 |
| 0.713422529132499 | 1 |
| 0.713854121709107 | 1 |
| 0.714285714285714 | 1 |
| 0.714717306862322 | 1 |
| 0.71514889943893 | 1 |
| 0.715580492015537 | 1 |
| 0.716012084592145 | 1 |
| 0.716443677168753 | 1 |
| 0.71687526974536 | 1 |
| 0.717306862321968 | 1 |
| 0.717738454898576 | 1 |
| 0.718170047475183 | 1 |
| 0.718601640051791 | 1 |
| 0.719033232628399 | 1 |
| 0.719464825205006 | 1 |
| 0.719896417781614 | 1 |
| 0.720328010358222 | 1 |
| 0.72075960293483 | 1 |
| 0.721191195511437 | 1 |
| 0.721622788088045 | 1 |
| 0.722054380664653 | 1 |
| 0.72248597324126 | 1 |
| 0.722917565817868 | 1 |
| 0.723349158394476 | 1 |
| 0.723780750971083 | 1 |
| 0.724212343547691 | 1 |
| 0.724643936124299 | 1 |
| 0.725075528700906 | 1 |
| 0.725507121277514 | 1 |
| 0.725938713854122 | 1 |
| 0.726370306430729 | 1 |
| 0.726801899007337 | 1 |
| 0.727233491583945 | 1 |
| 0.727665084160552 | 1 |
| 0.72809667673716 | 1 |
| 0.728528269313768 | 1 |
| 0.728959861890375 | 1 |
| 0.729391454466983 | 1 |
| 0.729823047043591 | 1 |
| 0.730254639620199 | 1 |
| 0.730686232196806 | 1 |
| 0.731117824773414 | 1 |
| 0.731549417350022 | 1 |
| 0.731981009926629 | 1 |
| 0.732412602503237 | 1 |
| 0.732844195079845 | 1 |
| 0.733275787656452 | 1 |
| 0.73370738023306 | 1 |
| 0.734138972809668 | 1 |
| 0.734570565386275 | 1 |
| 0.735002157962883 | 1 |
| 0.735433750539491 | 1 |
| 0.735865343116098 | 1 |
| 0.736296935692706 | 1 |
| 0.736728528269314 | 1 |
| 0.737160120845922 | 1 |
| 0.737591713422529 | 1 |
| 0.738023305999137 | 1 |
| 0.738454898575744 | 1 |
| 0.738886491152352 | 1 |
| 0.73931808372896 | 1 |
| 0.739749676305568 | 1 |
| 0.740181268882175 | 1 |
| 0.740612861458783 | 1 |
| 0.741044454035391 | 1 |
| 0.741476046611998 | 1 |
| 0.741907639188606 | 1 |
| 0.742339231765214 | 1 |
| 0.742770824341821 | 1 |
| 0.743202416918429 | 1 |
| 0.743634009495037 | 1 |
| 0.744065602071644 | 1 |
| 0.744497194648252 | 1 |
| 0.74492878722486 | 1 |
| 0.745360379801467 | 1 |
| 0.745791972378075 | 1 |
| 0.746223564954683 | 1 |
| 0.746655157531291 | 1 |
| 0.747086750107898 | 1 |
| 0.747518342684506 | 1 |
| 0.747949935261113 | 1 |
| 0.748381527837721 | 1 |
| 0.748813120414329 | 1 |
| 0.749244712990937 | 1 |
| 0.749676305567544 | 1 |
| 0.750107898144152 | 1 |
| 0.75053949072076 | 1 |
| 0.750971083297367 | 1 |
| 0.751402675873975 | 1 |
| 0.751834268450583 | 1 |
| 0.75226586102719 | 1 |
| 0.752697453603798 | 1 |
| 0.753129046180406 | 1 |
| 0.753560638757013 | 1 |
| 0.753992231333621 | 1 |
| 0.754423823910229 | 1 |
| 0.754855416486836 | 1 |
| 0.755287009063444 | 1 |
| 0.755718601640052 | 1 |
| 0.75615019421666 | 1 |
| 0.756581786793267 | 1 |
| 0.757013379369875 | 1 |
| 0.757444971946483 | 1 |
| 0.75787656452309 | 1 |
| 0.758308157099698 | 1 |
| 0.758739749676306 | 1 |
| 0.759171342252913 | 1 |
| 0.759602934829521 | 1 |
| 0.760034527406129 | 1 |
| 0.760466119982736 | 1 |
| 0.760897712559344 | 1 |
| 0.761329305135952 | 1 |
| 0.761760897712559 | 1 |
| 0.762192490289167 | 1 |
| 0.762624082865775 | 1 |
| 0.763055675442382 | 1 |
| 0.76348726801899 | 1 |
| 0.763918860595598 | 1 |
| 0.764350453172205 | 1 |
| 0.764782045748813 | 1 |
| 0.765213638325421 | 1 |
| 0.765645230902029 | 1 |
| 0.766076823478636 | 1 |
| 0.766508416055244 | 1 |
| 0.766940008631851 | 1 |
| 0.767371601208459 | 1 |
| 0.767803193785067 | 1 |
| 0.768234786361675 | 1 |
| 0.768666378938282 | 1 |
| 0.76909797151489 | 1 |
| 0.769529564091498 | 1 |
| 0.769961156668105 | 1 |
| 0.770392749244713 | 1 |
| 0.770824341821321 | 1 |
| 0.771255934397928 | 1 |
| 0.771687526974536 | 1 |
| 0.772119119551144 | 1 |
| 0.772550712127751 | 1 |
| 0.772982304704359 | 1 |
| 0.773413897280967 | 1 |
| 0.773845489857574 | 1 |
| 0.774277082434182 | 1 |
| 0.77470867501079 | 1 |
| 0.775140267587398 | 1 |
| 0.775571860164005 | 1 |
| 0.776003452740613 | 1 |
| 0.776435045317221 | 1 |
| 0.776866637893828 | 1 |
| 0.777298230470436 | 1 |
| 0.777729823047044 | 1 |
| 0.778161415623651 | 1 |
| 0.778593008200259 | 1 |
| 0.779024600776867 | 1 |
| 0.779456193353474 | 1 |
| 0.779887785930082 | 1 |
| 0.78031937850669 | 1 |
| 0.780750971083297 | 1 |
| 0.781182563659905 | 1 |
| 0.781614156236513 | 1 |
| 0.78204574881312 | 1 |
| 0.782477341389728 | 1 |
| 0.782908933966336 | 1 |
| 0.783340526542943 | 1 |
| 0.783772119119551 | 1 |
| 0.784203711696159 | 1 |
| 0.784635304272766 | 1 |
| 0.785066896849374 | 1 |
| 0.785498489425982 | 1 |
| 0.785930082002589 | 1 |
| 0.786361674579197 | 1 |
| 0.786793267155805 | 1 |
| 0.787224859732413 | 1 |
| 0.78765645230902 | 1 |
| 0.788088044885628 | 1 |
| 0.788519637462236 | 1 |
| 0.788951230038843 | 1 |
| 0.789382822615451 | 1 |
| 0.789814415192059 | 1 |
| 0.790246007768666 | 1 |
| 0.790677600345274 | 1 |
| 0.791109192921882 | 1 |
| 0.791540785498489 | 1 |
| 0.791972378075097 | 1 |
| 0.792403970651705 | 1 |
| 0.792835563228312 | 1 |
| 0.79326715580492 | 1 |
| 0.793698748381528 | 1 |
| 0.794130340958136 | 1 |
| 0.794561933534743 | 1 |
| 0.794993526111351 | 1 |
| 0.795425118687959 | 1 |
| 0.795856711264566 | 1 |
| 0.796288303841174 | 1 |
| 0.796719896417782 | 1 |
| 0.797151488994389 | 1 |
| 0.797583081570997 | 1 |
| 0.798014674147605 | 1 |
| 0.798446266724212 | 1 |
| 0.79887785930082 | 1 |
| 0.799309451877428 | 1 |
| 0.799741044454035 | 1 |
| 0.800172637030643 | 1 |
| 0.800604229607251 | 1 |
| 0.801035822183859 | 1 |
| 0.801467414760466 | 1 |
| 0.801899007337074 | 1 |
| 0.802330599913682 | 1 |
| 0.802762192490289 | 1 |
| 0.803193785066897 | 1 |
| 0.803625377643504 | 1 |
| 0.804056970220112 | 1 |
| 0.80448856279672 | 1 |
| 0.804920155373328 | 1 |
| 0.805351747949935 | 1 |
| 0.805783340526543 | 1 |
| 0.806214933103151 | 1 |
| 0.806646525679758 | 1 |
| 0.807078118256366 | 1 |
| 0.807509710832974 | 1 |
| 0.807941303409581 | 1 |
| 0.808372895986189 | 1 |
| 0.808804488562797 | 1 |
| 0.809236081139404 | 1 |
| 0.809667673716012 | 1 |
| 0.81009926629262 | 1 |
| 0.810530858869227 | 1 |
| 0.810962451445835 | 1 |
| 0.811394044022443 | 1 |
| 0.81182563659905 | 1 |
| 0.812257229175658 | 1 |
| 0.812688821752266 | 1 |
| 0.813120414328873 | 1 |
| 0.813552006905481 | 1 |
| 0.813983599482089 | 1 |
| 0.814415192058697 | 1 |
| 0.814846784635304 | 1 |
| 0.815278377211912 | 1 |
| 0.81570996978852 | 1 |
| 0.816141562365127 | 1 |
| 0.816573154941735 | 1 |
| 0.817004747518343 | 1 |
| 0.81743634009495 | 1 |
| 0.817867932671558 | 1 |
| 0.818299525248166 | 1 |
| 0.818731117824773 | 1 |
| 0.819162710401381 | 1 |
| 0.819594302977989 | 1 |
| 0.820025895554596 | 1 |
| 0.820457488131204 | 1 |
| 0.820889080707812 | 1 |
| 0.821320673284419 | 1 |
| 0.821752265861027 | 1 |
| 0.822183858437635 | 1 |
| 0.822615451014242 | 1 |
| 0.82304704359085 | 1 |
| 0.823478636167458 | 1 |
| 0.823910228744066 | 1 |
| 0.824341821320673 | 1 |
| 0.824773413897281 | 1 |
| 0.825205006473889 | 1 |
| 0.825636599050496 | 1 |
| 0.826068191627104 | 1 |
| 0.826499784203712 | 1 |
| 0.826931376780319 | 1 |
| 0.827362969356927 | 1 |
| 0.827794561933535 | 1 |
| 0.828226154510142 | 1 |
| 0.82865774708675 | 1 |
| 0.829089339663358 | 1 |
| 0.829520932239965 | 1 |
| 0.829952524816573 | 1 |
| 0.830384117393181 | 1 |
| 0.830815709969789 | 1 |
| 0.831247302546396 | 1 |
| 0.831678895123004 | 1 |
| 0.832110487699612 | 1 |
| 0.832542080276219 | 1 |
| 0.832973672852827 | 1 |
| 0.833405265429435 | 1 |
| 0.833836858006042 | 1 |
| 0.83426845058265 | 1 |
| 0.834700043159258 | 1 |
| 0.835131635735865 | 1 |
| 0.835563228312473 | 1 |
| 0.835994820889081 | 1 |
| 0.836426413465688 | 1 |
| 0.836858006042296 | 1 |
| 0.837289598618904 | 1 |
| 0.837721191195512 | 1 |
| 0.838152783772119 | 1 |
| 0.838584376348727 | 1 |
| 0.839015968925335 | 1 |
| 0.839447561501942 | 1 |
| 0.83987915407855 | 1 |
| 0.840310746655157 | 1 |
| 0.840742339231765 | 1 |
| 0.841173931808373 | 1 |
| 0.841605524384981 | 1 |
| 0.842037116961588 | 1 |
| 0.842468709538196 | 1 |
| 0.842900302114804 | 1 |
| 0.843331894691411 | 1 |
| 0.843763487268019 | 1 |
| 0.844195079844627 | 1 |
| 0.844626672421234 | 1 |
| 0.845058264997842 | 1 |
| 0.84548985757445 | 1 |
| 0.845921450151057 | 1 |
| 0.846353042727665 | 1 |
| 0.846784635304273 | 1 |
| 0.84721622788088 | 1 |
| 0.847647820457488 | 1 |
| 0.848079413034096 | 1 |
| 0.848511005610703 | 1 |
| 0.848942598187311 | 1 |
| 0.849374190763919 | 1 |
| 0.849805783340527 | 1 |
| 0.850237375917134 | 1 |
| 0.850668968493742 | 1 |
| 0.85110056107035 | 1 |
| 0.851532153646957 | 1 |
| 0.851963746223565 | 1 |
| 0.852395338800173 | 1 |
| 0.85282693137678 | 1 |
| 0.853258523953388 | 1 |
| 0.853690116529996 | 1 |
| 0.854121709106603 | 1 |
| 0.854553301683211 | 1 |
| 0.854984894259819 | 1 |
| 0.855416486836426 | 1 |
| 0.855848079413034 | 1 |
| 0.856279671989642 | 1 |
| 0.856711264566249 | 1 |
| 0.857142857142857 | 1 |
| 0.857574449719465 | 1 |
| 0.858006042296072 | 1 |
| 0.85843763487268 | 1 |
| 0.858869227449288 | 1 |
| 0.859300820025896 | 1 |
| 0.859732412602503 | 1 |
| 0.860164005179111 | 1 |
| 0.860595597755719 | 1 |
| 0.861027190332326 | 1 |
| 0.861458782908934 | 1 |
| 0.861890375485542 | 1 |
| 0.862321968062149 | 1 |
| 0.862753560638757 | 1 |
| 0.863185153215365 | 1 |
| 0.863616745791972 | 1 |
| 0.86404833836858 | 1 |
| 0.864479930945188 | 1 |
| 0.864911523521795 | 1 |
| 0.865343116098403 | 1 |
| 0.865774708675011 | 1 |
| 0.866206301251618 | 1 |
| 0.866637893828226 | 1 |
| 0.867069486404834 | 1 |
| 0.867501078981441 | 1 |
| 0.867932671558049 | 1 |
| 0.868364264134657 | 1 |
| 0.868795856711265 | 1 |
| 0.869227449287872 | 1 |
| 0.86965904186448 | 1 |
| 0.870090634441088 | 1 |
| 0.870522227017695 | 1 |
| 0.870953819594303 | 1 |
| 0.871385412170911 | 1 |
| 0.871817004747518 | 1 |
| 0.872248597324126 | 1 |
| 0.872680189900734 | 1 |
| 0.873111782477341 | 1 |
| 0.873543375053949 | 1 |
| 0.873974967630557 | 1 |
| 0.874406560207164 | 1 |
| 0.874838152783772 | 1 |
| 0.87526974536038 | 1 |
| 0.875701337936988 | 1 |
| 0.876132930513595 | 1 |
| 0.876564523090203 | 1 |
| 0.87699611566681 | 1 |
| 0.877427708243418 | 1 |
| 0.877859300820026 | 1 |
| 0.878290893396633 | 1 |
| 0.878722485973241 | 1 |
| 0.879154078549849 | 1 |
| 0.879585671126457 | 1 |
| 0.880017263703064 | 1 |
| 0.880448856279672 | 1 |
| 0.88088044885628 | 1 |
| 0.881312041432887 | 1 |
| 0.881743634009495 | 1 |
| 0.882175226586103 | 1 |
| 0.88260681916271 | 1 |
| 0.883038411739318 | 1 |
| 0.883470004315926 | 1 |
| 0.883901596892533 | 1 |
| 0.884333189469141 | 1 |
| 0.884764782045749 | 1 |
| 0.885196374622356 | 1 |
| 0.885627967198964 | 1 |
| 0.886059559775572 | 1 |
| 0.88649115235218 | 1 |
| 0.886922744928787 | 1 |
| 0.887354337505395 | 1 |
| 0.887785930082003 | 1 |
| 0.88821752265861 | 1 |
| 0.888649115235218 | 1 |
| 0.889080707811826 | 1 |
| 0.889512300388433 | 1 |
| 0.889943892965041 | 1 |
| 0.890375485541649 | 1 |
| 0.890807078118256 | 1 |
| 0.891238670694864 | 1 |
| 0.891670263271472 | 1 |
| 0.892101855848079 | 1 |
| 0.892533448424687 | 1 |
| 0.892965041001295 | 1 |
| 0.893396633577902 | 1 |
| 0.89382822615451 | 1 |
| 0.894259818731118 | 1 |
| 0.894691411307726 | 1 |
| 0.895123003884333 | 1 |
| 0.895554596460941 | 1 |
| 0.895986189037549 | 1 |
| 0.896417781614156 | 1 |
| 0.896849374190764 | 1 |
| 0.897280966767372 | 1 |
| 0.897712559343979 | 1 |
| 0.898144151920587 | 1 |
| 0.898575744497195 | 1 |
| 0.899007337073802 | 1 |
| 0.89943892965041 | 1 |
| 0.899870522227018 | 1 |
| 0.900302114803625 | 1 |
| 0.900733707380233 | 1 |
| 0.901165299956841 | 1 |
| 0.901596892533448 | 1 |
| 0.902028485110056 | 1 |
| 0.902460077686664 | 1 |
| 0.902891670263271 | 1 |
| 0.903323262839879 | 1 |
| 0.903754855416487 | 1 |
| 0.904186447993095 | 1 |
| 0.904618040569702 | 1 |
| 0.90504963314631 | 1 |
| 0.905481225722918 | 1 |
| 0.905912818299525 | 1 |
| 0.906344410876133 | 1 |
| 0.906776003452741 | 1 |
| 0.907207596029348 | 1 |
| 0.907639188605956 | 1 |
| 0.908070781182564 | 1 |
| 0.908502373759171 | 1 |
| 0.908933966335779 | 1 |
| 0.909365558912387 | 1 |
| 0.909797151488994 | 1 |
| 0.910228744065602 | 1 |
| 0.91066033664221 | 1 |
| 0.911091929218817 | 1 |
| 0.911523521795425 | 1 |
| 0.911955114372033 | 1 |
| 0.91238670694864 | 1 |
| 0.912818299525248 | 1 |
| 0.913249892101856 | 1 |
| 0.913681484678463 | 1 |
| 0.914113077255071 | 1 |
| 0.914544669831679 | 1 |
| 0.914976262408286 | 1 |
| 0.915407854984894 | 1 |
| 0.915839447561502 | 1 |
| 0.91627104013811 | 1 |
| 0.916702632714717 | 1 |
| 0.917134225291325 | 1 |
| 0.917565817867933 | 1 |
| 0.91799741044454 | 1 |
| 0.918429003021148 | 1 |
| 0.918860595597756 | 1 |
| 0.919292188174363 | 1 |
| 0.919723780750971 | 1 |
| 0.920155373327579 | 1 |
| 0.920586965904186 | 1 |
| 0.921018558480794 | 1 |
| 0.921450151057402 | 1 |
| 0.921881743634009 | 1 |
| 0.922313336210617 | 1 |
| 0.922744928787225 | 1 |
| 0.923176521363832 | 1 |
| 0.92360811394044 | 1 |
| 0.924039706517048 | 1 |
| 0.924471299093656 | 1 |
| 0.924902891670263 | 1 |
| 0.925334484246871 | 1 |
| 0.925766076823479 | 1 |
| 0.926197669400086 | 1 |
| 0.926629261976694 | 1 |
| 0.927060854553302 | 1 |
| 0.927492447129909 | 1 |
| 0.927924039706517 | 1 |
| 0.928355632283125 | 1 |
| 0.928787224859732 | 1 |
| 0.92921881743634 | 1 |
| 0.929650410012948 | 1 |
| 0.930082002589555 | 1 |
| 0.930513595166163 | 1 |
| 0.930945187742771 | 1 |
| 0.931376780319379 | 1 |
| 0.931808372895986 | 1 |
| 0.932239965472594 | 1 |
| 0.932671558049202 | 1 |
| 0.933103150625809 | 1 |
| 0.933534743202417 | 1 |
| 0.933966335779025 | 1 |
| 0.934397928355632 | 1 |
| 0.93482952093224 | 1 |
| 0.935261113508848 | 1 |
| 0.935692706085455 | 1 |
| 0.936124298662063 | 1 |
| 0.936555891238671 | 1 |
| 0.936987483815278 | 1 |
| 0.937419076391886 | 1 |
| 0.937850668968494 | 1 |
| 0.938282261545101 | 1 |
| 0.938713854121709 | 1 |
| 0.939145446698317 | 1 |
| 0.939577039274924 | 1 |
| 0.940008631851532 | 1 |
| 0.94044022442814 | 1 |
| 0.940871817004748 | 1 |
| 0.941303409581355 | 1 |
| 0.941735002157963 | 1 |
| 0.942166594734571 | 1 |
| 0.942598187311178 | 1 |
| 0.943029779887786 | 1 |
| 0.943461372464394 | 1 |
| 0.943892965041001 | 1 |
| 0.944324557617609 | 1 |
| 0.944756150194217 | 1 |
| 0.945187742770824 | 1 |
| 0.945619335347432 | 1 |
| 0.94605092792404 | 1 |
| 0.946482520500647 | 1 |
| 0.946914113077255 | 1 |
| 0.947345705653863 | 1 |
| 0.94777729823047 | 1 |
| 0.948208890807078 | 1 |
| 0.948640483383686 | 1 |
| 0.949072075960294 | 1 |
| 0.949503668536901 | 1 |
| 0.949935261113509 | 1 |
| 0.950366853690116 | 1 |
| 0.950798446266724 | 1 |
| 0.951230038843332 | 1 |
| 0.951661631419939 | 1 |
| 0.952093223996547 | 1 |
| 0.952524816573155 | 1 |
| 0.952956409149763 | 1 |
| 0.95338800172637 | 1 |
| 0.953819594302978 | 1 |
| 0.954251186879586 | 1 |
| 0.954682779456193 | 1 |
| 0.955114372032801 | 1 |
| 0.955545964609409 | 1 |
| 0.955977557186016 | 1 |
| 0.956409149762624 | 1 |
| 0.956840742339232 | 1 |
| 0.957272334915839 | 1 |
| 0.957703927492447 | 1 |
| 0.958135520069055 | 1 |
| 0.958567112645662 | 1 |
| 0.95899870522227 | 1 |
| 0.959430297798878 | 1 |
| 0.959861890375485 | 1 |
| 0.960293482952093 | 1 |
| 0.960725075528701 | 1 |
| 0.961156668105308 | 1 |
| 0.961588260681916 | 1 |
| 0.962019853258524 | 1 |
| 0.962451445835132 | 1 |
| 0.962883038411739 | 1 |
| 0.963314630988347 | 1 |
| 0.963746223564955 | 1 |
| 0.964177816141562 | 1 |
| 0.96460940871817 | 1 |
| 0.965041001294778 | 1 |
| 0.965472593871385 | 1 |
| 0.965904186447993 | 1 |
| 0.966335779024601 | 1 |
| 0.966767371601208 | 1 |
| 0.967198964177816 | 1 |
| 0.967630556754424 | 1 |
| 0.968062149331031 | 1 |
| 0.968493741907639 | 1 |
| 0.968925334484247 | 1 |
| 0.969356927060855 | 1 |
| 0.969788519637462 | 1 |
| 0.97022011221407 | 1 |
| 0.970651704790678 | 1 |
| 0.971083297367285 | 1 |
| 0.971514889943893 | 1 |
| 0.971946482520501 | 1 |
| 0.972378075097108 | 1 |
| 0.972809667673716 | 1 |
| 0.973241260250324 | 1 |
| 0.973672852826931 | 1 |
| 0.974104445403539 | 1 |
| 0.974536037980147 | 1 |
| 0.974967630556754 | 1 |
| 0.975399223133362 | 1 |
| 0.97583081570997 | 1 |
| 0.976262408286578 | 1 |
| 0.976694000863185 | 1 |
| 0.977125593439793 | 1 |
| 0.977557186016401 | 1 |
| 0.977988778593008 | 1 |
| 0.978420371169616 | 1 |
| 0.978851963746224 | 1 |
| 0.979283556322831 | 1 |
| 0.979715148899439 | 1 |
| 0.980146741476047 | 1 |
| 0.980578334052654 | 1 |
| 0.981009926629262 | 1 |
| 0.98144151920587 | 1 |
| 0.981873111782477 | 1 |
| 0.982304704359085 | 1 |
| 0.982736296935693 | 1 |
| 0.9831678895123 | 1 |
| 0.983599482088908 | 1 |
| 0.984031074665516 | 1 |
| 0.984462667242123 | 1 |
| 0.984894259818731 | 1 |
| 0.985325852395339 | 1 |
| 0.985757444971947 | 1 |
| 0.986189037548554 | 1 |
| 0.986620630125162 | 1 |
| 0.987052222701769 | 1 |
| 0.987483815278377 | 1 |
| 0.987915407854985 | 1 |
| 0.988347000431593 | 1 |
| 0.9887785930082 | 1 |
| 0.989210185584808 | 1 |
| 0.989641778161416 | 1 |
| 0.990073370738023 | 1 |
| 0.990504963314631 | 1 |
| 0.990936555891239 | 1 |
| 0.991368148467846 | 1 |
| 0.991799741044454 | 1 |
| 0.992231333621062 | 1 |
| 0.992662926197669 | 1 |
| 0.993094518774277 | 1 |
| 0.993526111350885 | 1 |
| 0.993957703927492 | 1 |
| 0.9943892965041 | 1 |
| 0.994820889080708 | 1 |
| 0.995252481657315 | 1 |
| 0.995684074233923 | 1 |
| 0.996115666810531 | 1 |
| 0.996547259387138 | 1 |
| 0.996978851963746 | 1 |
| 0.997410444540354 | 1 |
| 0.997842037116962 | 1 |
| 0.998273629693569 | 1 |
| 0.998705222270177 | 1 |
| 0.999136814846785 | 1 |